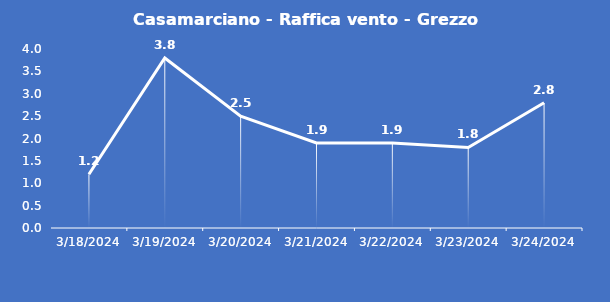
| Category | Casamarciano - Raffica vento - Grezzo (m/s) |
|---|---|
| 3/18/24 | 1.2 |
| 3/19/24 | 3.8 |
| 3/20/24 | 2.5 |
| 3/21/24 | 1.9 |
| 3/22/24 | 1.9 |
| 3/23/24 | 1.8 |
| 3/24/24 | 2.8 |